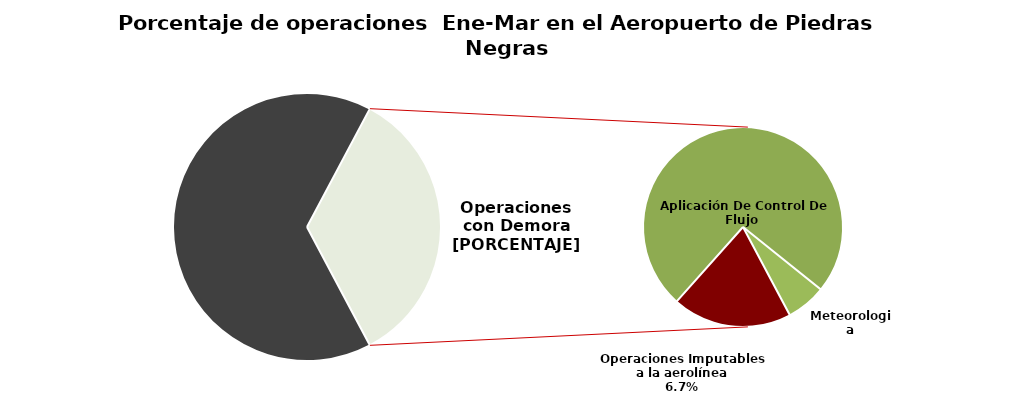
| Category | Series 0 |
|---|---|
| Operaciones a Tiempo | 59 |
| Operaciones Imputables a la aerolínea | 6 |
| Aplicación De Control De Flujo  | 23 |
| Meteorologia | 2 |